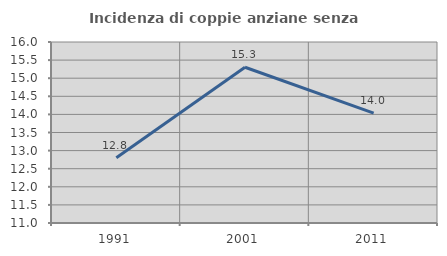
| Category | Incidenza di coppie anziane senza figli  |
|---|---|
| 1991.0 | 12.802 |
| 2001.0 | 15.302 |
| 2011.0 | 14.035 |